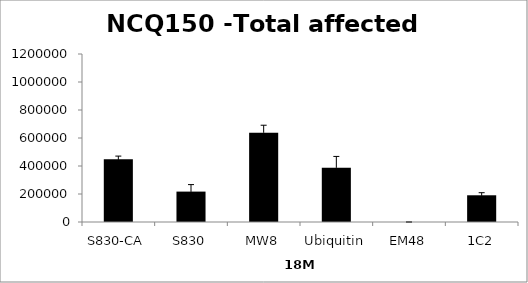
| Category | Series 0 |
|---|---|
| S830-CA | 448266.405 |
| S830 | 217164.743 |
| MW8 | 638207.511 |
| Ubiquitin | 387532.694 |
| EM48 | 0 |
| 1C2 | 190866.81 |